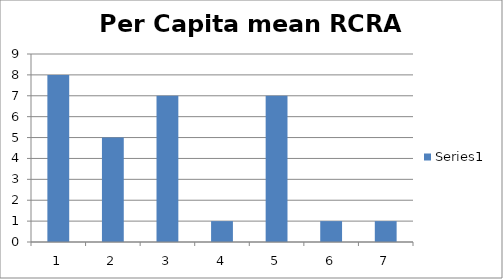
| Category | Series 0 |
|---|---|
| 0 | 8 |
| 1 | 5 |
| 2 | 7 |
| 3 | 1 |
| 4 | 7 |
| 5 | 1 |
| 6 | 1 |